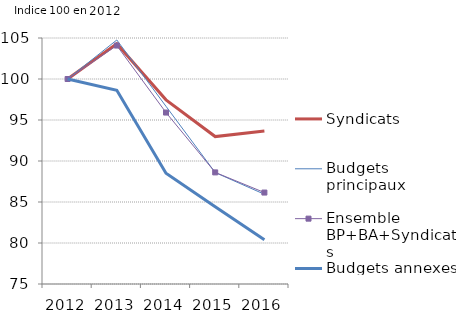
| Category | Syndicats  | Budgets principaux | Ensemble BP+BA+Syndicats | Budgets annexes |
|---|---|---|---|---|
| 2012.0 | 100 | 100 | 100 | 100 |
| 2013.0 | 104.291 | 104.759 | 104.08 | 98.618 |
| 2014.0 | 97.458 | 96.668 | 95.908 | 88.502 |
| 2015.0 | 92.979 | 88.595 | 88.61 | 84.424 |
| 2016.0 | 93.663 | 85.943 | 86.152 | 80.384 |